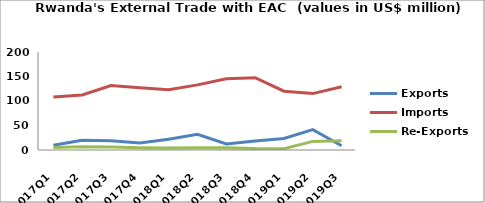
| Category | Exports | Imports | Re-Exports |
|---|---|---|---|
| 2017Q1 | 9.664 | 107.939 | 4.884 |
| 2017Q2 | 19.646 | 112.299 | 6.46 |
| 2017Q3 | 18.919 | 131.397 | 5.955 |
| 2017Q4 | 14.466 | 126.939 | 4.636 |
| 2018Q1 | 21.787 | 122.952 | 3.88 |
| 2018Q2 | 31.913 | 132.868 | 4.622 |
| 2018Q3 | 12.298 | 145.348 | 4.725 |
| 2018Q4 | 18.335 | 147.432 | 2.99 |
| 2019Q1 | 23.42 | 119.935 | 2.57 |
| 2019Q2 | 41.554 | 115.098 | 17.51 |
| 2019Q3 | 8.6 | 129.04 | 18.741 |